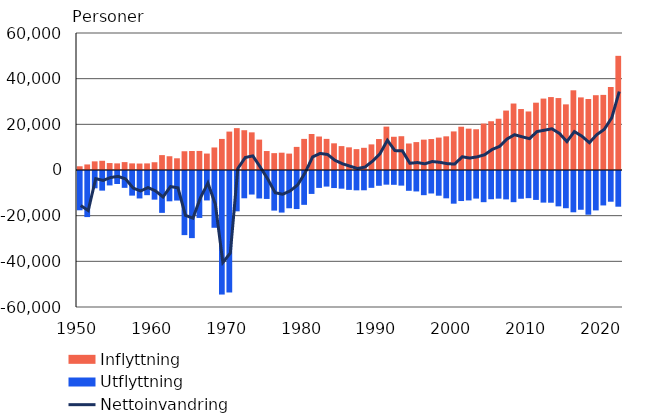
| Category | Inflyttning | Utflyttning |
|---|---|---|
| 1950.0 | 1634 | -17211 |
| 1951.0 | 2432 | -20185 |
| 1952.0 | 3787 | -7576 |
| 1953.0 | 4037 | -8597 |
| 1954.0 | 3045 | -6320 |
| 1955.0 | 2900 | -5687 |
| 1956.0 | 3457 | -7379 |
| 1957.0 | 2901 | -10787 |
| 1958.0 | 2834 | -12025 |
| 1959.0 | 2893 | -10587 |
| 1960.0 | 3396 | -12552 |
| 1961.0 | 6521 | -18336 |
| 1962.0 | 6026 | -13280 |
| 1963.0 | 5127 | -12947 |
| 1964.0 | 8214 | -28082 |
| 1965.0 | 8311 | -29394 |
| 1966.0 | 8351 | -20554 |
| 1967.0 | 7202 | -12898 |
| 1968.0 | 9872 | -24866 |
| 1969.0 | 13608 | -54107 |
| 1970.0 | 16824 | -53205 |
| 1971.0 | 18338 | -17665 |
| 1972.0 | 17421 | -11951 |
| 1973.0 | 16491 | -10309 |
| 1974.0 | 13311 | -12027 |
| 1975.0 | 8307 | -12237 |
| 1976.0 | 7387 | -17346 |
| 1977.0 | 7580 | -18209 |
| 1978.0 | 7184 | -16327 |
| 1979.0 | 10122 | -16661 |
| 1980.0 | 13626 | -14824 |
| 1981.0 | 15771 | -10042 |
| 1982.0 | 14661 | -7403 |
| 1983.0 | 13629 | -6822 |
| 1984.0 | 11686 | -7467 |
| 1985.0 | 10465 | -7739 |
| 1986.0 | 9927 | -8269 |
| 1987.0 | 9142 | -8475 |
| 1988.0 | 9720 | -8447 |
| 1989.0 | 11219 | -7374 |
| 1990.0 | 13558 | -6477 |
| 1991.0 | 19001 | -5984 |
| 1992.0 | 14554 | -6055 |
| 1993.0 | 14795 | -6405 |
| 1994.0 | 11611 | -8672 |
| 1995.0 | 12222 | -8957 |
| 1996.0 | 13294 | -10587 |
| 1997.0 | 13564 | -9854 |
| 1998.0 | 14192 | -10817 |
| 1999.0 | 14744 | -11966 |
| 2000.0 | 16895 | -14311 |
| 2001.0 | 18955 | -13153 |
| 2002.0 | 18112 | -12891 |
| 2003.0 | 17838 | -12083 |
| 2004.0 | 20333 | -13656 |
| 2005.0 | 21355 | -12369 |
| 2006.0 | 22451 | -12107 |
| 2007.0 | 26029 | -12443 |
| 2008.0 | 29114 | -13657 |
| 2009.0 | 26699 | -12151 |
| 2010.0 | 25636 | -11905 |
| 2011.0 | 29481 | -12660 |
| 2012.0 | 31278 | -13845 |
| 2013.0 | 31941 | -13893 |
| 2014.0 | 31507 | -15486 |
| 2015.0 | 28746 | -16305 |
| 2016.0 | 34905 | -18082 |
| 2017.0 | 31797 | -16973 |
| 2018.0 | 31106 | -19141 |
| 2019.0 | 32758 | -17263 |
| 2020.0 | 32898 | -15084 |
| 2021.0 | 36364 | -13459 |
| 2022.0 | 49998 | -15635 |